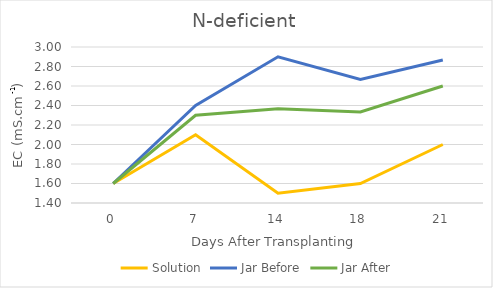
| Category | Solution | Jar Before | Jar After |
|---|---|---|---|
| 0.0 | 1.6 | 1.6 | 1.6 |
| 7.0 | 2.1 | 2.4 | 2.3 |
| 14.0 | 1.5 | 2.9 | 2.367 |
| 18.0 | 1.6 | 2.667 | 2.333 |
| 21.0 | 2 | 2.867 | 2.6 |